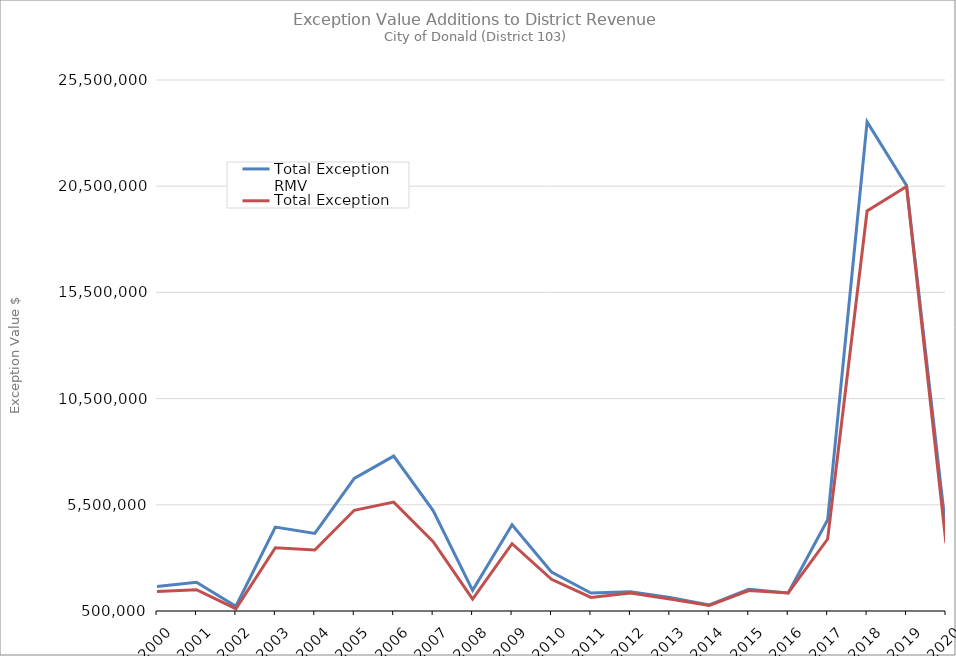
| Category | Total Exception RMV | Total Exception MAV |
|---|---|---|
| 2000.0 | 1652611 | 1418755 |
| 2001.0 | 1856011 | 1504979 |
| 2002.0 | 723550 | 607983 |
| 2003.0 | 4451758 | 3476808 |
| 2004.0 | 4155412 | 3374591 |
| 2005.0 | 6746727 | 5240747 |
| 2006.0 | 7793756 | 5628106 |
| 2007.0 | 5227463 | 3760903 |
| 2008.0 | 1472899 | 1056570 |
| 2009.0 | 4562671 | 3667126 |
| 2010.0 | 2335709 | 1994339 |
| 2011.0 | 1343797 | 1141872 |
| 2012.0 | 1409949 | 1351876 |
| 2013.0 | 1132570 | 1063025 |
| 2014.0 | 788699 | 762759 |
| 2015.0 | 1518790 | 1464801 |
| 2016.0 | 1351931 | 1351929 |
| 2017.0 | 4794085 | 3888825 |
| 2018.0 | 23528983 | 19332500 |
| 2019.0 | 20536836 | 20485325 |
| 2020.0 | 4269757 | 3689539 |